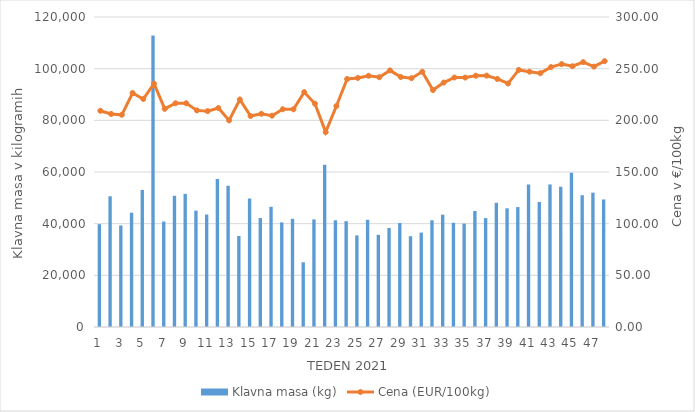
| Category | Klavna masa (kg) |
|---|---|
| 1.0 | 39814 |
| 2.0 | 50603 |
| 3.0 | 39295 |
| 4.0 | 44250 |
| 5.0 | 53061 |
| 6.0 | 112816 |
| 7.0 | 40829 |
| 8.0 | 50775 |
| 9.0 | 51535 |
| 10.0 | 45040 |
| 11.0 | 43536 |
| 12.0 | 57246 |
| 13.0 | 54680 |
| 14.0 | 35237 |
| 15.0 | 49721 |
| 16.0 | 42177 |
| 17.0 | 46525 |
| 18.0 | 40491 |
| 19.0 | 41888 |
| 20.0 | 25048 |
| 21.0 | 41651 |
| 22.0 | 62774 |
| 23.0 | 41297 |
| 24.0 | 40971 |
| 25.0 | 35465 |
| 26.0 | 41489 |
| 27.0 | 35675 |
| 28.0 | 38316 |
| 29.0 | 40265 |
| 30.0 | 35146 |
| 31.0 | 36548 |
| 32.0 | 41314 |
| 33.0 | 43471 |
| 34.0 | 40333 |
| 35.0 | 40041 |
| 36.0 | 44895 |
| 37.0 | 42158 |
| 38.0 | 48077 |
| 39.0 | 45950 |
| 40.0 | 46433 |
| 41.0 | 55121 |
| 42.0 | 48414 |
| 43.0 | 55179 |
| 44.0 | 54294 |
| 45.0 | 59707 |
| 46.0 | 51007 |
| 47.0 | 52010 |
| 48.0 | 49369 |